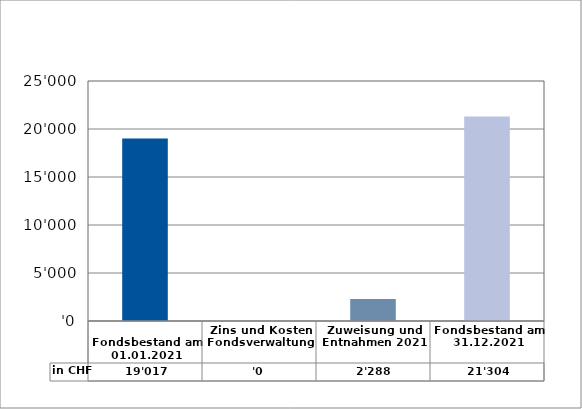
| Category | in CHF |
|---|---|
| 
Fondsbestand am 01.01.2021

 | 19016.5 |
| Zins und Kosten Fondsverwaltung | 0 |
| Zuweisung und Entnahmen 2021 | 2287.95 |
| Fondsbestand am 31.12.2021 | 21304.45 |